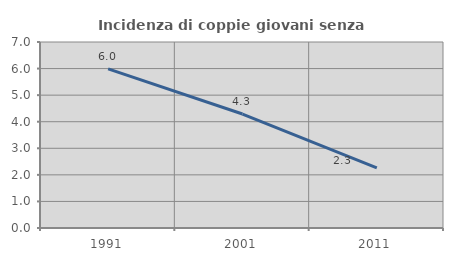
| Category | Incidenza di coppie giovani senza figli |
|---|---|
| 1991.0 | 5.988 |
| 2001.0 | 4.29 |
| 2011.0 | 2.261 |